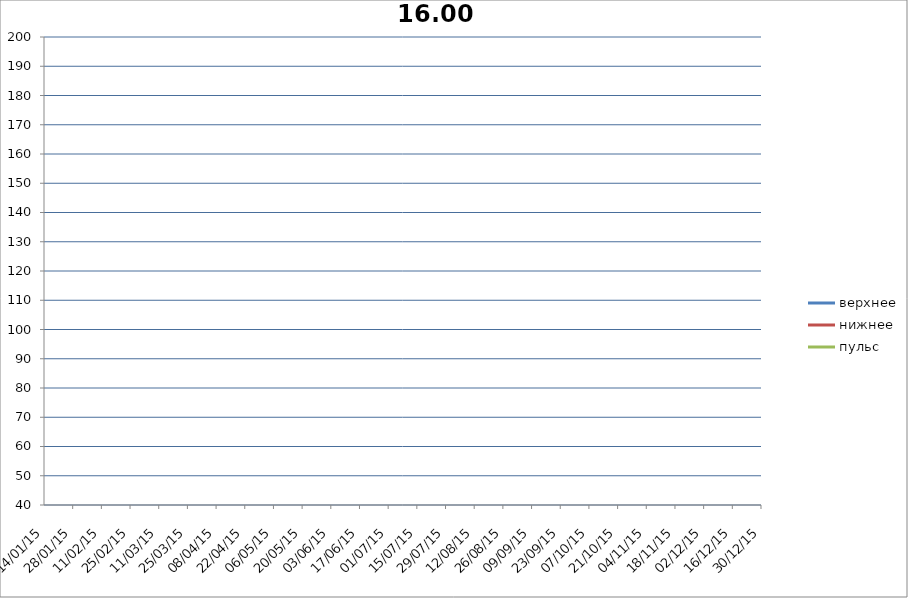
| Category | верхнее | нижнее | пульс |
|---|---|---|---|
| 2015-01-14 | 0 | 0 | 0 |
| 2015-01-28 | 0 | 0 | 0 |
| 2015-02-11 | 0 | 0 | 0 |
| 2015-02-25 | 0 | 0 | 0 |
| 2015-03-11 | 0 | 0 | 0 |
| 2015-03-25 | 0 | 0 | 0 |
| 2015-04-08 | 0 | 0 | 0 |
| 2015-04-22 | 0 | 0 | 0 |
| 2015-05-06 | 0 | 0 | 0 |
| 2015-05-20 | 0 | 0 | 0 |
| 2015-06-03 | 0 | 0 | 0 |
| 2015-06-17 | 0 | 0 | 0 |
| 2015-07-01 | 0 | 0 | 0 |
| 2015-07-15 | 0 | 0 | 0 |
| 2015-07-29 | 0 | 0 | 0 |
| 2015-08-12 | 0 | 0 | 0 |
| 2015-08-26 | 0 | 0 | 0 |
| 2015-09-09 | 0 | 0 | 0 |
| 2015-09-23 | 0 | 0 | 0 |
| 2015-10-07 | 0 | 0 | 0 |
| 2015-10-21 | 0 | 0 | 0 |
| 2015-11-04 | 0 | 0 | 0 |
| 2015-11-18 | 0 | 0 | 0 |
| 2015-12-02 | 0 | 0 | 0 |
| 2015-12-16 | 0 | 0 | 0 |
| 2015-12-30 | 0 | 0 | 0 |